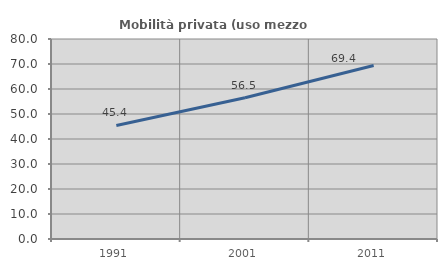
| Category | Mobilità privata (uso mezzo privato) |
|---|---|
| 1991.0 | 45.416 |
| 2001.0 | 56.499 |
| 2011.0 | 69.428 |